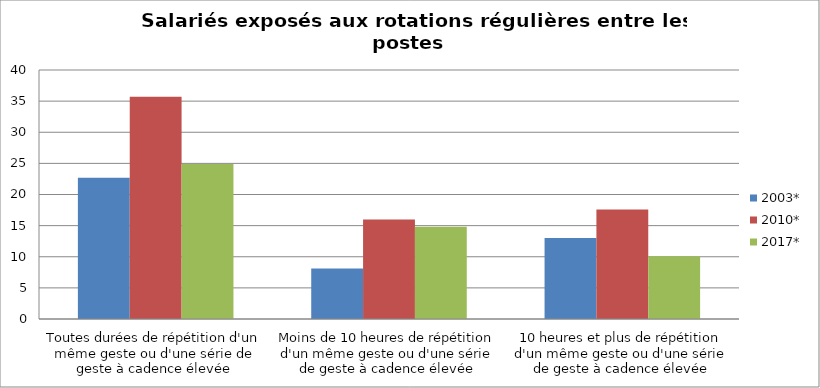
| Category | 2003* | 2010* | 2017* |
|---|---|---|---|
| Toutes durées de répétition d'un même geste ou d'une série de geste à cadence élevée | 22.7 | 35.7 | 24.9 |
| Moins de 10 heures de répétition d'un même geste ou d'une série de geste à cadence élevée | 8.1 | 16 | 14.8 |
| 10 heures et plus de répétition d'un même geste ou d'une série de geste à cadence élevée | 13 | 17.6 | 10.1 |